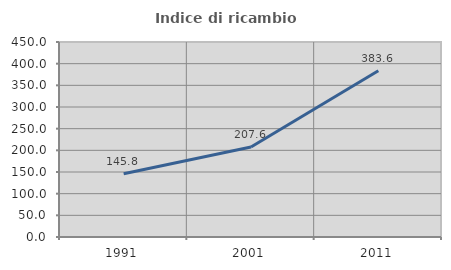
| Category | Indice di ricambio occupazionale  |
|---|---|
| 1991.0 | 145.838 |
| 2001.0 | 207.601 |
| 2011.0 | 383.629 |